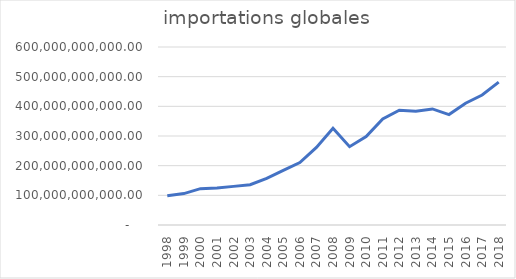
| Category | importations globales |
|---|---|
| 1998.0 | 98675056092 |
| 1999.0 | 105920747102 |
| 2000.0 | 122499901090 |
| 2001.0 | 124717830514 |
| 2002.0 | 130198313997 |
| 2003.0 | 135919643335 |
| 2004.0 | 157405530717 |
| 2005.0 | 184379805632 |
| 2006.0 | 210553607539 |
| 2007.0 | 261287516799 |
| 2008.0 | 326042243203 |
| 2009.0 | 263981701292 |
| 2010.0 | 297963365563 |
| 2011.0 | 357769591761 |
| 2012.0 | 386948556399.567 |
| 2013.0 | 383719891706.852 |
| 2014.0 | 391295731413.272 |
| 2015.0 | 372224856464.067 |
| 2016.0 | 410583588374.116 |
| 2017.0 | 438079671080.671 |
| 2018.0 | 481441814690.256 |